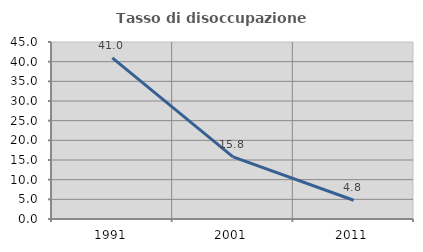
| Category | Tasso di disoccupazione giovanile  |
|---|---|
| 1991.0 | 40.984 |
| 2001.0 | 15.789 |
| 2011.0 | 4.762 |